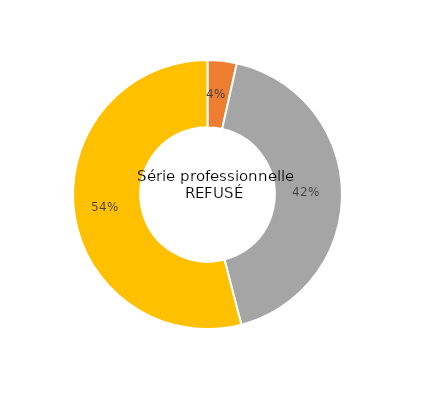
| Category | Series 0 |
|---|---|
| ... ayant validé la maîtrise du socle, et obtenu une moyenne aux épreuves terminales supérieure ou égale à 10/20 | 0 |
| ... n'ayant pas validé la maîtrise du socle, et obtenu une moyenne aux épreuves terminales supérieure ou égale à 10/20 | 3.5 |
| ... ayant validé la maîtrise du socle, et obtenu une moyenne aux épreuves terminales inférieure à 10/20 | 42.4 |
| ... n'ayant pas validé la maîtrise du socle, et obtenu une moyenne aux épreuves terminales inférieure à 10/20 | 54 |